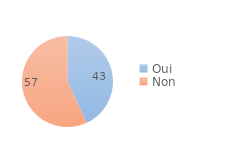
| Category | Series 0 |
|---|---|
| Oui | 43.06 |
| Non | 56.94 |